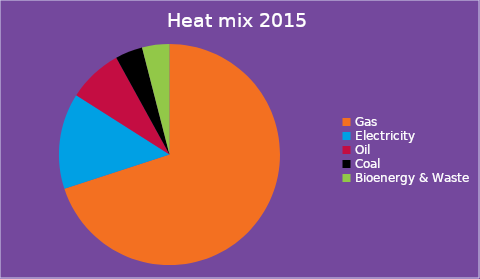
| Category | Series 0 |
|---|---|
| Gas  | 0.7 |
| Electricity | 0.14 |
| Oil | 0.08 |
| Coal  | 0.04 |
| Bioenergy & Waste | 0.04 |